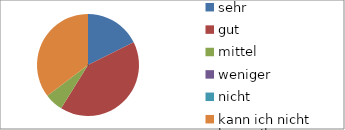
| Category | Series 0 |
|---|---|
| sehr | 3 |
| gut | 7 |
| mittel | 1 |
| weniger | 0 |
| nicht | 0 |
| kann ich nicht beurteilen | 6 |
| keine Angabe | 0 |